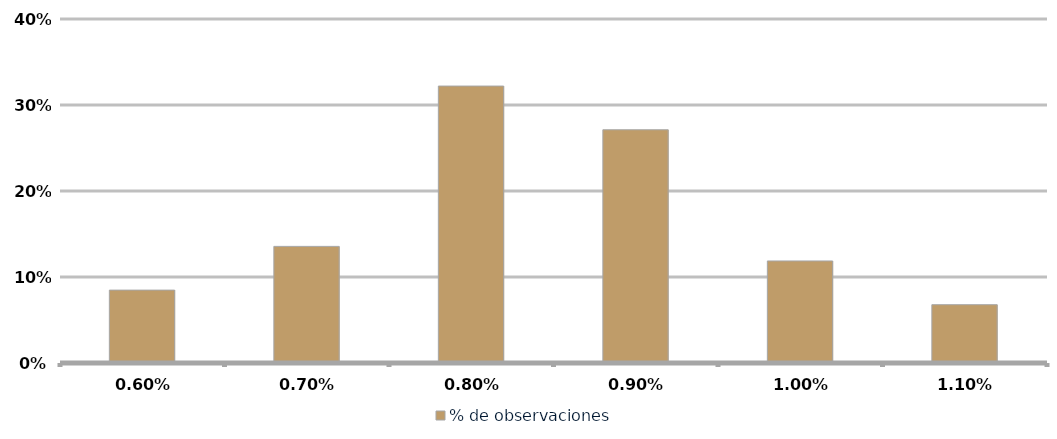
| Category | % de observaciones  |
|---|---|
| 0.006 | 0.085 |
| 0.007 | 0.136 |
| 0.008 | 0.322 |
| 0.009000000000000001 | 0.271 |
| 0.010000000000000002 | 0.119 |
| 0.011000000000000003 | 0.068 |